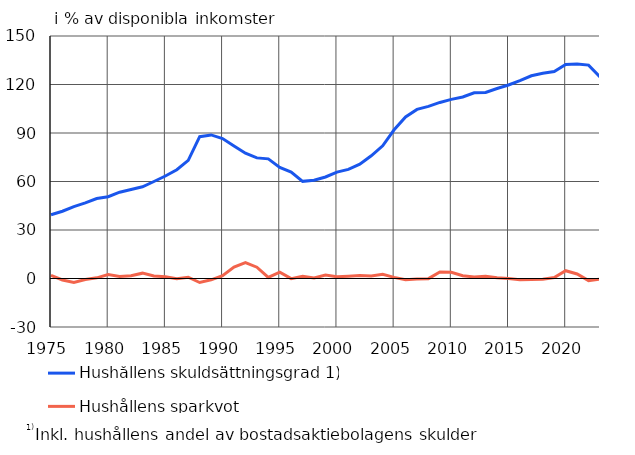
| Category | Hushållens skuldsättningsgrad 1) | Hushållens sparkvot |
|---|---|---|
| 1975 | 39.4 | 1.9 |
| 1976 | 41.6 | -0.9 |
| 1977 | 44.5 | -2.5 |
| 1978 | 46.8 | -0.6 |
| 1979 | 49.5 | 0.4 |
| 1980 | 50.6 | 2.4 |
| 1981 | 53.4 | 1.3 |
| 1982 | 55.1 | 1.7 |
| 1983 | 56.7 | 3.3 |
| 1984 | 60 | 1.6 |
| 1985 | 63.4 | 1.1 |
| 1986 | 67.3 | -0.2 |
| 1987 | 73.1 | 0.8 |
| 1988 | 87.7 | -2.5 |
| 1989 | 88.8 | -0.8 |
| 1990 | 86.6 | 1.7 |
| 1991 | 82 | 7.1 |
| 1992 | 77.5 | 9.8 |
| 1993 | 74.6 | 7 |
| 1994 | 74 | 0.7 |
| 1995 | 68.7 | 3.9 |
| 1996 | 65.8 | -0.1 |
| 1997 | 60.1 | 1.4 |
| 1998 | 60.8 | 0.3 |
| 1999 | 62.8 | 2.2 |
| 2000 | 65.8 | 1.1 |
| 2001 | 67.5 | 1.4 |
| 2002 | 70.7 | 1.8 |
| 2003 | 75.9 | 1.6 |
| 2004 | 82.1 | 2.6 |
| 2005 | 92 | 0.7 |
| 2006 | 99.9 | -0.8 |
| 2007 | 104.6 | -0.3 |
| 2008 | 106.5 | -0.1 |
| 2009 | 108.9 | 4 |
| 2010 | 110.8 | 3.9 |
| 2011 | 112.3 | 1.7 |
| 2012 | 114.9 | 1 |
| 2013 | 115.1 | 1.4 |
| 2014 | 117.5 | 0.5 |
| 2015 | 119.7 | 0 |
| 2016 | 122.4 | -0.8 |
| 2017 | 125.4 | -0.6 |
| 2018 | 127 | -0.5 |
| 2019 | 128 | 0.6 |
| 2020 | 132.4 | 4.8 |
| 2021 | 132.7 | 2.8 |
| 2022* | 132 | -1.3 |
| 2023* | 124.6 | -0.4 |